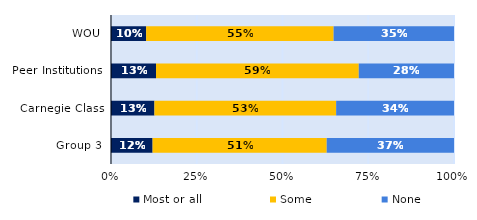
| Category | Most or all | Some | None |
|---|---|---|---|
| WOU | 0.102 | 0.547 | 0.351 |
| Peer Institutions | 0.131 | 0.591 | 0.278 |
| Carnegie Class | 0.127 | 0.53 | 0.344 |
| Group 3 | 0.121 | 0.508 | 0.371 |